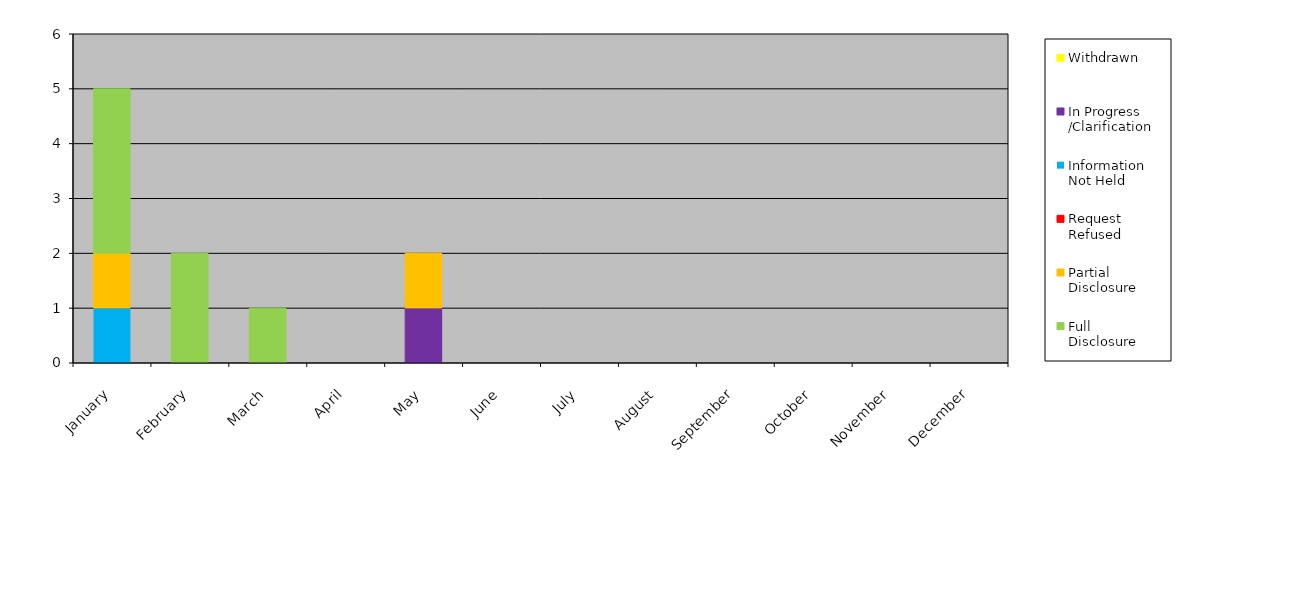
| Category | Withdrawn | In Progress
/Clarification | Information
Not Held | Request
Refused | Partial
Disclosure | Full
Disclosure |
|---|---|---|---|---|---|---|
| January | 0 | 0 | 1 | 0 | 1 | 3 |
| February | 0 | 0 | 0 | 0 | 0 | 2 |
| March | 0 | 0 | 0 | 0 | 0 | 1 |
| April | 0 | 0 | 0 | 0 | 0 | 0 |
| May | 0 | 1 | 0 | 0 | 1 | 0 |
| June | 0 | 0 | 0 | 0 | 0 | 0 |
| July | 0 | 0 | 0 | 0 | 0 | 0 |
| August | 0 | 0 | 0 | 0 | 0 | 0 |
| September | 0 | 0 | 0 | 0 | 0 | 0 |
| October | 0 | 0 | 0 | 0 | 0 | 0 |
| November | 0 | 0 | 0 | 0 | 0 | 0 |
| December | 0 | 0 | 0 | 0 | 0 | 0 |